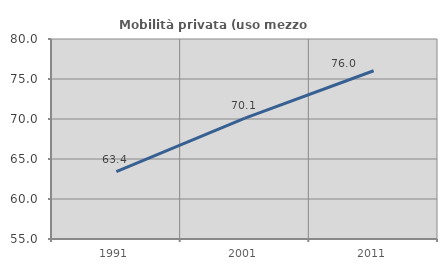
| Category | Mobilità privata (uso mezzo privato) |
|---|---|
| 1991.0 | 63.411 |
| 2001.0 | 70.119 |
| 2011.0 | 76.034 |